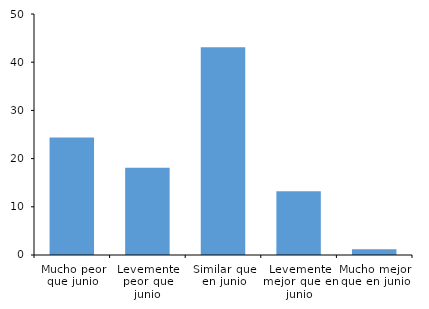
| Category | Series 0 |
|---|---|
| Mucho peor que junio | 24.377 |
| Levemente peor que junio | 18.087 |
| Similar que en junio | 43.119 |
| Levemente mejor que en junio | 13.237 |
| Mucho mejor que en junio | 1.18 |